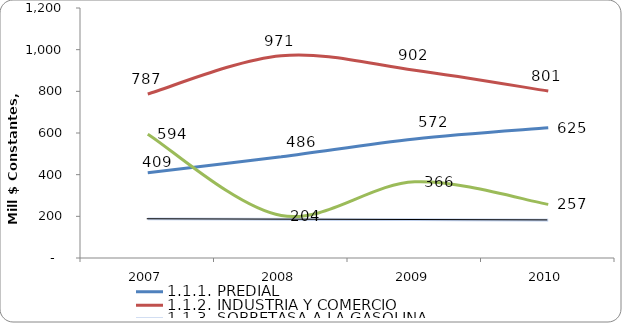
| Category | 1.1.1. PREDIAL | 1.1.2. INDUSTRIA Y COMERCIO | 1.1.3. SOBRETASA A LA GASOLINA | 1.1.4. OTROS |
|---|---|---|---|---|
| 2007 | 408.825 | 787.355 | 188.511 | 594.239 |
| 2008 | 486.397 | 971.069 | 186.326 | 203.672 |
| 2009 | 571.604 | 901.528 | 184.625 | 365.791 |
| 2010 | 624.748 | 801.254 | 182.996 | 257.308 |